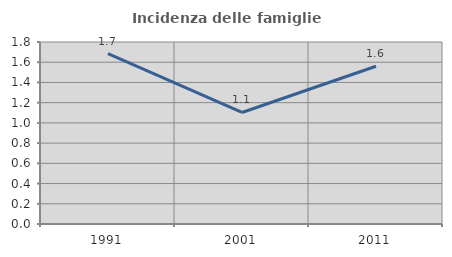
| Category | Incidenza delle famiglie numerose |
|---|---|
| 1991.0 | 1.685 |
| 2001.0 | 1.103 |
| 2011.0 | 1.56 |